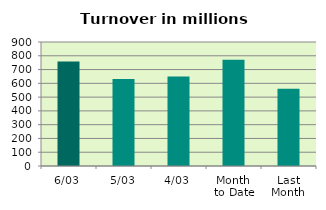
| Category | Series 0 |
|---|---|
| 6/03 | 757.997 |
| 5/03 | 632.285 |
| 4/03 | 650.477 |
| Month 
to Date | 772.071 |
| Last
Month | 561.452 |